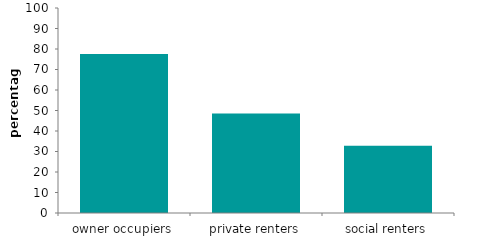
| Category | Series 0 |
|---|---|
| owner occupiers | 77.602 |
| private renters | 48.589 |
| social renters | 32.794 |